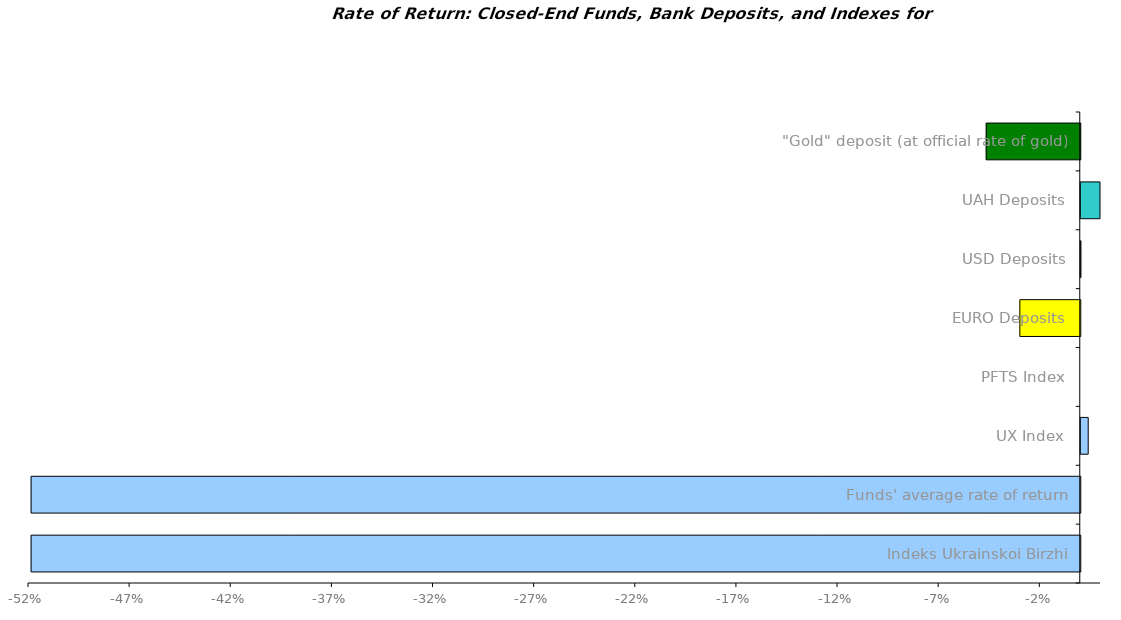
| Category | Series 0 |
|---|---|
| Indeks Ukrainskoi Birzhi | -0.519 |
| Funds' average rate of return | -0.519 |
| UX Index | 0.004 |
| PFTS Index | 0 |
| EURO Deposits | -0.03 |
| USD Deposits | 0 |
| UAH Deposits | 0.013 |
| "Gold" deposit (at official rate of gold) | -0.046 |